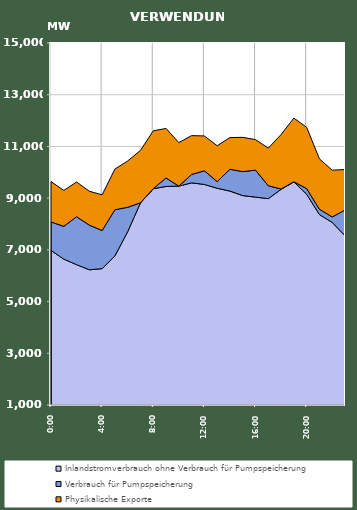
| Category | Inlandstromverbrauch ohne Verbrauch für Pumpspeicherung | Verbrauch für Pumpspeicherung | Physikalische Exporte |
|---|---|---|---|
| 2007-01-17 | 6978.4 | 1099.948 | 1562.212 |
| 2007-01-17 01:00:00 | 6641.342 | 1267.626 | 1390.383 |
| 2007-01-17 02:00:00 | 6427.364 | 1853.682 | 1344.767 |
| 2007-01-17 03:00:00 | 6228.928 | 1727.038 | 1310.475 |
| 2007-01-17 04:00:00 | 6274.336 | 1472.404 | 1382.249 |
| 2007-01-17 05:00:00 | 6765.844 | 1785.993 | 1574.219 |
| 2007-01-17 06:00:00 | 7703.634 | 942.538 | 1791.678 |
| 2007-01-17 07:00:00 | 8815.975 | 2.322 | 2029.707 |
| 2007-01-17 08:00:00 | 9363.251 | 2.329 | 2238.138 |
| 2007-01-17 09:00:00 | 9451.991 | 328.995 | 1914.759 |
| 2007-01-17 10:00:00 | 9464.764 | 1.12 | 1683.526 |
| 2007-01-17 11:00:00 | 9590.717 | 324.706 | 1502.795 |
| 2007-01-17 12:00:00 | 9529.331 | 528.531 | 1347.192 |
| 2007-01-17 13:00:00 | 9381.739 | 256.248 | 1389.032 |
| 2007-01-17 14:00:00 | 9272.438 | 843.935 | 1226.846 |
| 2007-01-17 15:00:00 | 9098.249 | 927.476 | 1325.634 |
| 2007-01-17 16:00:00 | 9039.378 | 1044.098 | 1179.944 |
| 2007-01-17 17:00:00 | 8979.086 | 501.121 | 1453.176 |
| 2007-01-17 18:00:00 | 9340.729 | 11.99 | 2107.556 |
| 2007-01-17 19:00:00 | 9630.427 | 1.995 | 2464.934 |
| 2007-01-17 20:00:00 | 9151.72 | 218.707 | 2369.281 |
| 2007-01-17 21:00:00 | 8365.493 | 204.447 | 1949.914 |
| 2007-01-17 22:00:00 | 8061.191 | 211.156 | 1809.591 |
| 2007-01-17 23:00:00 | 7545.068 | 995.728 | 1564.072 |